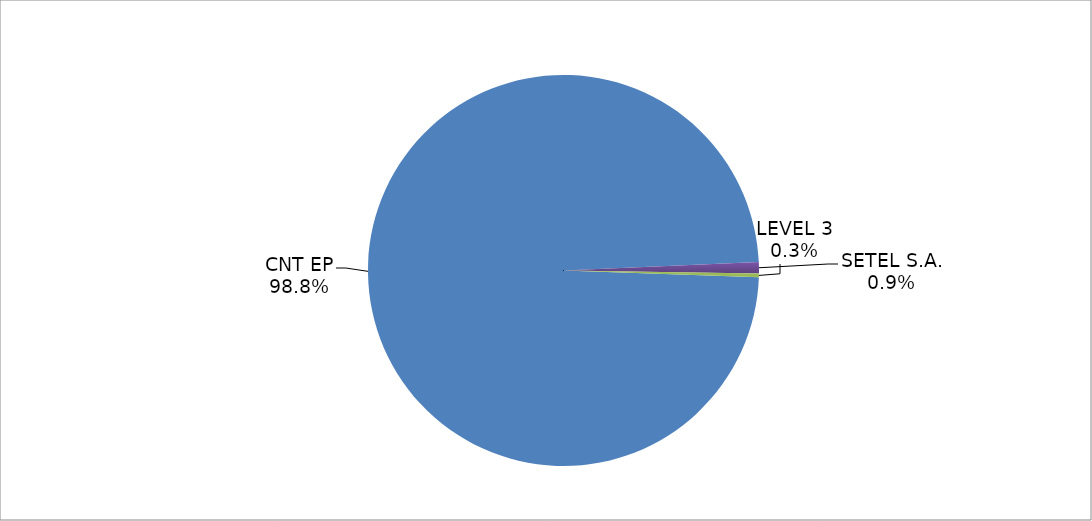
| Category | Series 0 |
|---|---|
| CNT EP | 317 |
| SETEL S.A. | 3 |
| LEVEL 3 | 1 |